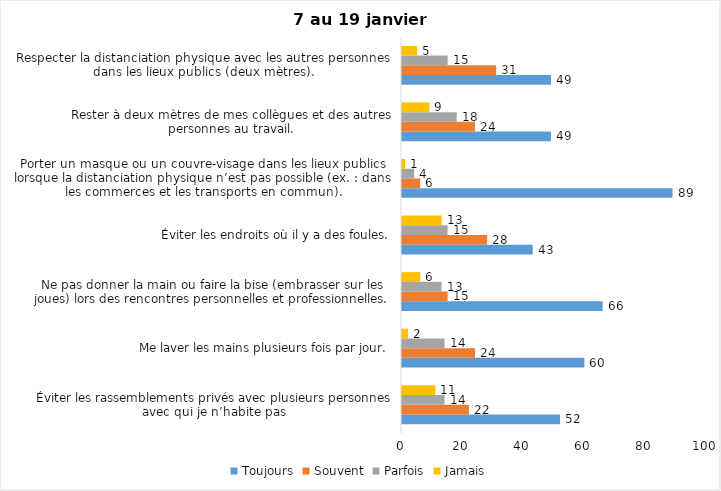
| Category | Toujours | Souvent | Parfois | Jamais |
|---|---|---|---|---|
| Éviter les rassemblements privés avec plusieurs personnes avec qui je n’habite pas | 52 | 22 | 14 | 11 |
| Me laver les mains plusieurs fois par jour. | 60 | 24 | 14 | 2 |
| Ne pas donner la main ou faire la bise (embrasser sur les joues) lors des rencontres personnelles et professionnelles. | 66 | 15 | 13 | 6 |
| Éviter les endroits où il y a des foules. | 43 | 28 | 15 | 13 |
| Porter un masque ou un couvre-visage dans les lieux publics lorsque la distanciation physique n’est pas possible (ex. : dans les commerces et les transports en commun). | 89 | 6 | 4 | 1 |
| Rester à deux mètres de mes collègues et des autres personnes au travail. | 49 | 24 | 18 | 9 |
| Respecter la distanciation physique avec les autres personnes dans les lieux publics (deux mètres). | 49 | 31 | 15 | 5 |